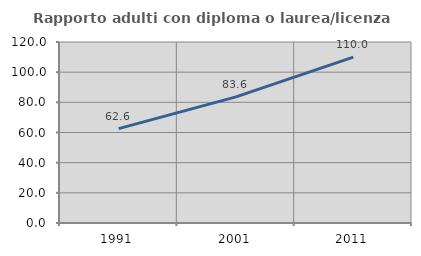
| Category | Rapporto adulti con diploma o laurea/licenza media  |
|---|---|
| 1991.0 | 62.603 |
| 2001.0 | 83.615 |
| 2011.0 | 110 |